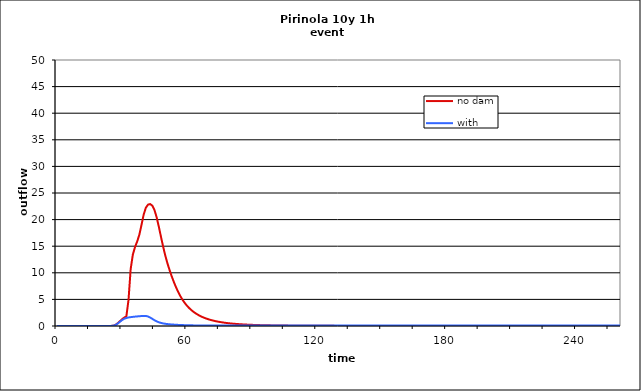
| Category | no dam | with dam |
|---|---|---|
| 0.0 | 0 | 0 |
| 1.0 | 0 | 0 |
| 2.0 | 0 | 0 |
| 3.0 | 0 | 0 |
| 4.0 | 0 | 0 |
| 5.0 | 0 | 0 |
| 6.0 | 0 | 0 |
| 7.0 | 0 | 0 |
| 8.0 | 0 | 0 |
| 9.0 | 0 | 0 |
| 10.0 | 0 | 0 |
| 11.0 | 0 | 0 |
| 12.0 | 0 | 0 |
| 13.0 | 0 | 0 |
| 14.0 | 0 | 0 |
| 15.0 | 0 | 0 |
| 16.0 | 0 | 0 |
| 17.0 | 0 | 0 |
| 18.0 | 0 | 0 |
| 19.0 | 0 | 0 |
| 20.0 | 0 | 0 |
| 21.0 | 0 | 0 |
| 22.0 | 0 | 0 |
| 23.0 | 0.002 | 0.002 |
| 24.0 | 0.007 | 0.007 |
| 25.0 | 0.019 | 0.019 |
| 26.0 | 0.05 | 0.048 |
| 27.0 | 0.219 | 0.187 |
| 28.0 | 0.524 | 0.455 |
| 29.0 | 0.889 | 0.791 |
| 30.0 | 1.252 | 1.106 |
| 31.0 | 1.58 | 1.35 |
| 32.0 | 1.794 | 1.507 |
| 33.0 | 4.907 | 1.602 |
| 34.0 | 10.728 | 1.667 |
| 35.0 | 13.42 | 1.718 |
| 36.0 | 14.839 | 1.762 |
| 37.0 | 15.893 | 1.802 |
| 38.0 | 17.152 | 1.838 |
| 39.0 | 19.005 | 1.871 |
| 40.0 | 20.935 | 1.902 |
| 41.0 | 22.223 | 1.898 |
| 42.0 | 22.808 | 1.791 |
| 43.0 | 22.924 | 1.593 |
| 44.0 | 22.619 | 1.341 |
| 45.0 | 21.783 | 1.085 |
| 46.0 | 20.428 | 0.869 |
| 47.0 | 18.667 | 0.703 |
| 48.0 | 16.753 | 0.579 |
| 49.0 | 14.894 | 0.485 |
| 50.0 | 13.216 | 0.414 |
| 51.0 | 11.752 | 0.361 |
| 52.0 | 10.464 | 0.319 |
| 53.0 | 9.286 | 0.285 |
| 54.0 | 8.211 | 0.256 |
| 55.0 | 7.232 | 0.231 |
| 56.0 | 6.356 | 0.208 |
| 57.0 | 5.579 | 0.188 |
| 58.0 | 4.902 | 0.171 |
| 59.0 | 4.316 | 0.157 |
| 60.0 | 3.813 | 0.144 |
| 61.0 | 3.379 | 0.133 |
| 62.0 | 2.999 | 0.124 |
| 63.0 | 2.67 | 0.116 |
| 64.0 | 2.383 | 0.109 |
| 65.0 | 2.129 | 0.104 |
| 66.0 | 1.907 | 0.099 |
| 67.0 | 1.712 | 0.094 |
| 68.0 | 1.54 | 0.091 |
| 69.0 | 1.388 | 0.088 |
| 70.0 | 1.252 | 0.086 |
| 71.0 | 1.131 | 0.084 |
| 72.0 | 1.025 | 0.083 |
| 73.0 | 0.93 | 0.082 |
| 74.0 | 0.846 | 0.082 |
| 75.0 | 0.77 | 0.081 |
| 76.0 | 0.702 | 0.081 |
| 77.0 | 0.64 | 0.081 |
| 78.0 | 0.583 | 0.08 |
| 79.0 | 0.533 | 0.08 |
| 80.0 | 0.488 | 0.08 |
| 81.0 | 0.447 | 0.08 |
| 82.0 | 0.411 | 0.08 |
| 83.0 | 0.378 | 0.08 |
| 84.0 | 0.348 | 0.079 |
| 85.0 | 0.321 | 0.079 |
| 86.0 | 0.296 | 0.079 |
| 87.0 | 0.273 | 0.079 |
| 88.0 | 0.253 | 0.079 |
| 89.0 | 0.234 | 0.079 |
| 90.0 | 0.216 | 0.079 |
| 91.0 | 0.201 | 0.079 |
| 92.0 | 0.186 | 0.079 |
| 93.0 | 0.173 | 0.079 |
| 94.0 | 0.161 | 0.079 |
| 95.0 | 0.15 | 0.079 |
| 96.0 | 0.14 | 0.079 |
| 97.0 | 0.131 | 0.079 |
| 98.0 | 0.122 | 0.079 |
| 99.0 | 0.114 | 0.079 |
| 100.0 | 0.107 | 0.079 |
| 101.0 | 0.1 | 0.079 |
| 102.0 | 0.094 | 0.079 |
| 103.0 | 0.088 | 0.079 |
| 104.0 | 0.083 | 0.079 |
| 105.0 | 0.078 | 0.079 |
| 106.0 | 0.073 | 0.079 |
| 107.0 | 0.069 | 0.079 |
| 108.0 | 0.065 | 0.079 |
| 109.0 | 0.061 | 0.079 |
| 110.0 | 0.058 | 0.079 |
| 111.0 | 0.055 | 0.079 |
| 112.0 | 0.052 | 0.079 |
| 113.0 | 0.049 | 0.079 |
| 114.0 | 0.046 | 0.079 |
| 115.0 | 0.044 | 0.079 |
| 116.0 | 0.042 | 0.079 |
| 117.0 | 0.039 | 0.079 |
| 118.0 | 0.037 | 0.079 |
| 119.0 | 0.036 | 0.079 |
| 120.0 | 0.034 | 0.079 |
| 121.0 | 0.032 | 0.079 |
| 122.0 | 0.031 | 0.079 |
| 123.0 | 0.029 | 0.079 |
| 124.0 | 0.028 | 0.079 |
| 125.0 | 0.026 | 0.079 |
| 126.0 | 0.025 | 0.079 |
| 127.0 | 0.024 | 0.079 |
| 128.0 | 0.023 | 0.079 |
| 129.0 | 0.022 | 0.079 |
| 130.0 | 0.021 | 0.079 |
| 131.0 | 0.02 | 0.079 |
| 132.0 | 0.019 | 0.079 |
| 133.0 | 0.018 | 0.079 |
| 134.0 | 0.017 | 0.079 |
| 135.0 | 0.017 | 0.079 |
| 136.0 | 0.016 | 0.079 |
| 137.0 | 0.015 | 0.079 |
| 138.0 | 0.015 | 0.079 |
| 139.0 | 0.014 | 0.079 |
| 140.0 | 0.013 | 0.079 |
| 141.0 | 0.013 | 0.079 |
| 142.0 | 0.012 | 0.079 |
| 143.0 | 0.012 | 0.079 |
| 144.0 | 0.011 | 0.079 |
| 145.0 | 0.011 | 0.079 |
| 146.0 | 0.01 | 0.079 |
| 147.0 | 0.01 | 0.079 |
| 148.0 | 0.009 | 0.079 |
| 149.0 | 0.009 | 0.079 |
| 150.0 | 0.009 | 0.079 |
| 151.0 | 0.008 | 0.079 |
| 152.0 | 0.008 | 0.079 |
| 153.0 | 0.007 | 0.079 |
| 154.0 | 0.007 | 0.079 |
| 155.0 | 0.007 | 0.079 |
| 156.0 | 0.006 | 0.079 |
| 157.0 | 0.006 | 0.079 |
| 158.0 | 0.006 | 0.079 |
| 159.0 | 0.006 | 0.079 |
| 160.0 | 0.005 | 0.079 |
| 161.0 | 0.005 | 0.079 |
| 162.0 | 0.005 | 0.079 |
| 163.0 | 0.005 | 0.079 |
| 164.0 | 0.004 | 0.079 |
| 165.0 | 0.004 | 0.079 |
| 166.0 | 0.004 | 0.079 |
| 167.0 | 0.004 | 0.079 |
| 168.0 | 0.003 | 0.079 |
| 169.0 | 0.003 | 0.079 |
| 170.0 | 0.003 | 0.079 |
| 171.0 | 0.003 | 0.079 |
| 172.0 | 0.003 | 0.079 |
| 173.0 | 0.003 | 0.079 |
| 174.0 | 0.002 | 0.079 |
| 175.0 | 0.002 | 0.079 |
| 176.0 | 0.002 | 0.079 |
| 177.0 | 0.002 | 0.079 |
| 178.0 | 0.002 | 0.079 |
| 179.0 | 0.002 | 0.079 |
| 180.0 | 0.002 | 0.079 |
| 181.0 | 0.002 | 0.079 |
| 182.0 | 0.001 | 0.079 |
| 183.0 | 0.001 | 0.079 |
| 184.0 | 0.001 | 0.079 |
| 185.0 | 0.001 | 0.079 |
| 186.0 | 0.001 | 0.079 |
| 187.0 | 0.001 | 0.079 |
| 188.0 | 0.001 | 0.079 |
| 189.0 | 0.001 | 0.079 |
| 190.0 | 0.001 | 0.079 |
| 191.0 | 0.001 | 0.079 |
| 192.0 | 0.001 | 0.079 |
| 193.0 | 0.001 | 0.079 |
| 194.0 | 0.001 | 0.079 |
| 195.0 | 0.001 | 0.079 |
| 196.0 | 0.001 | 0.079 |
| 197.0 | 0 | 0.079 |
| 198.0 | 0 | 0.079 |
| 199.0 | 0 | 0.079 |
| 200.0 | 0 | 0.079 |
| 201.0 | 0 | 0.079 |
| 202.0 | 0 | 0.079 |
| 203.0 | 0 | 0.079 |
| 204.0 | 0 | 0.079 |
| 205.0 | 0 | 0.079 |
| 206.0 | 0 | 0.079 |
| 207.0 | 0 | 0.079 |
| 208.0 | 0 | 0.079 |
| 209.0 | 0 | 0.079 |
| 210.0 | 0 | 0.079 |
| 211.0 | 0 | 0.079 |
| 212.0 | 0 | 0.079 |
| 213.0 | 0 | 0.079 |
| 214.0 | 0 | 0.079 |
| 215.0 | 0 | 0.079 |
| 216.0 | 0 | 0.079 |
| 217.0 | 0 | 0.079 |
| 218.0 | 0 | 0.079 |
| 219.0 | 0 | 0.079 |
| 220.0 | 0 | 0.079 |
| 221.0 | 0 | 0.079 |
| 222.0 | 0 | 0.079 |
| 223.0 | 0 | 0.079 |
| 224.0 | 0 | 0.079 |
| 225.0 | 0 | 0.079 |
| 226.0 | 0 | 0.079 |
| 227.0 | 0 | 0.079 |
| 228.0 | 0 | 0.079 |
| 229.0 | 0 | 0.079 |
| 230.0 | 0 | 0.079 |
| 231.0 | 0 | 0.079 |
| 232.0 | 0 | 0.079 |
| 233.0 | 0 | 0.079 |
| 234.0 | 0 | 0.079 |
| 235.0 | 0 | 0.079 |
| 236.0 | 0 | 0.079 |
| 237.0 | 0 | 0.079 |
| 238.0 | 0 | 0.079 |
| 239.0 | 0 | 0.079 |
| 240.0 | 0 | 0.079 |
| 241.0 | 0 | 0.079 |
| 242.0 | 0 | 0.078 |
| 243.0 | 0 | 0.078 |
| 244.0 | 0 | 0.078 |
| 245.0 | 0 | 0.078 |
| 246.0 | 0 | 0.078 |
| 247.0 | 0 | 0.078 |
| 248.0 | 0 | 0.078 |
| 249.0 | 0 | 0.078 |
| 250.0 | 0 | 0.078 |
| 251.0 | 0 | 0.078 |
| 252.0 | 0 | 0.078 |
| 253.0 | 0 | 0.078 |
| 254.0 | 0 | 0.078 |
| 255.0 | 0 | 0.078 |
| 256.0 | 0 | 0.078 |
| 257.0 | 0 | 0.078 |
| 258.0 | 0 | 0.078 |
| 259.0 | 0 | 0.078 |
| 260.0 | 0 | 0.078 |